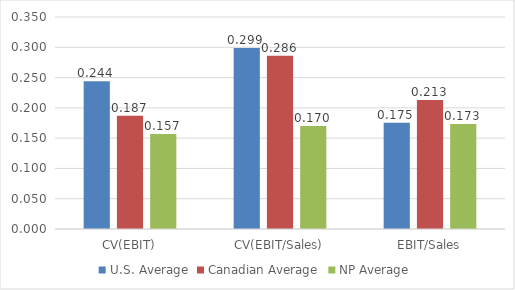
| Category | U.S. Average | Canadian Average | NP Average |
|---|---|---|---|
| CV(EBIT) | 0.244 | 0.187 | 0.157 |
| CV(EBIT/Sales) | 0.299 | 0.286 | 0.17 |
| EBIT/Sales | 0.175 | 0.213 | 0.173 |